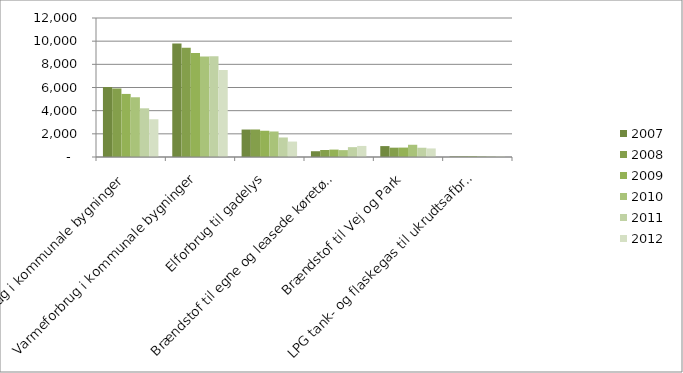
| Category | 2007 | 2008 | 2009 | 2010 | 2011 | 2012 |
|---|---|---|---|---|---|---|
| Elforbrug i kommunale bygninger | 6039.465 | 5917.512 | 5444.617 | 5157.503 | 4203.283 | 3258.48 |
| Varmeforbrug i kommunale bygninger | 9789.055 | 9432.734 | 8982.838 | 8667.013 | 8691.585 | 7511.417 |
| Elforbrug til gadelys | 2370.955 | 2375.595 | 2266.601 | 2204.007 | 1686.301 | 1333.127 |
| Brændstof til egne og leasede køretøjer | 498.165 | 605.882 | 638.839 | 593.911 | 850.418 | 954.874 |
| Brændstof til Vej og Park | 941.894 | 805.135 | 812.397 | 1056.648 | 799.818 | 738.691 |
| LPG tank- og flaskegas til ukrudtsafbrænding mm | 40.595 | 51.685 | 60.607 | 49.873 | 52.352 | 56.944 |